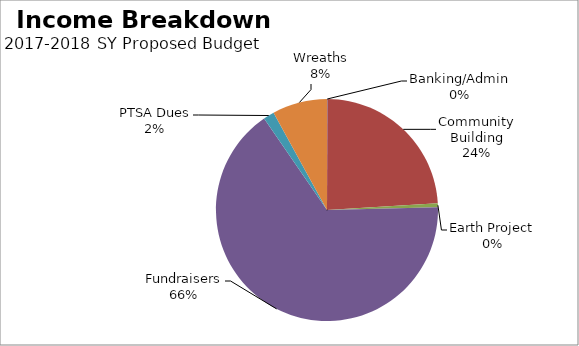
| Category | Series 0 |
|---|---|
| Banking/Admin | 100 |
| Community Building | 37500 |
| Earth Project | 850 |
| Fundraisers | 102900 |
| PTSA Dues | 2500 |
| Wreaths | 12500 |